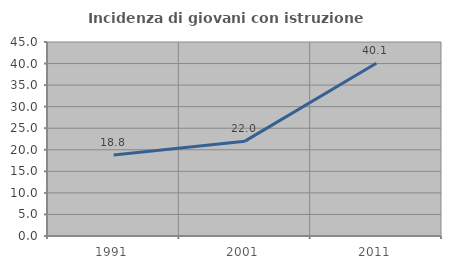
| Category | Incidenza di giovani con istruzione universitaria |
|---|---|
| 1991.0 | 18.767 |
| 2001.0 | 22 |
| 2011.0 | 40.052 |